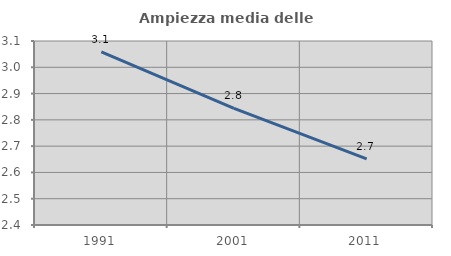
| Category | Ampiezza media delle famiglie |
|---|---|
| 1991.0 | 3.058 |
| 2001.0 | 2.844 |
| 2011.0 | 2.652 |